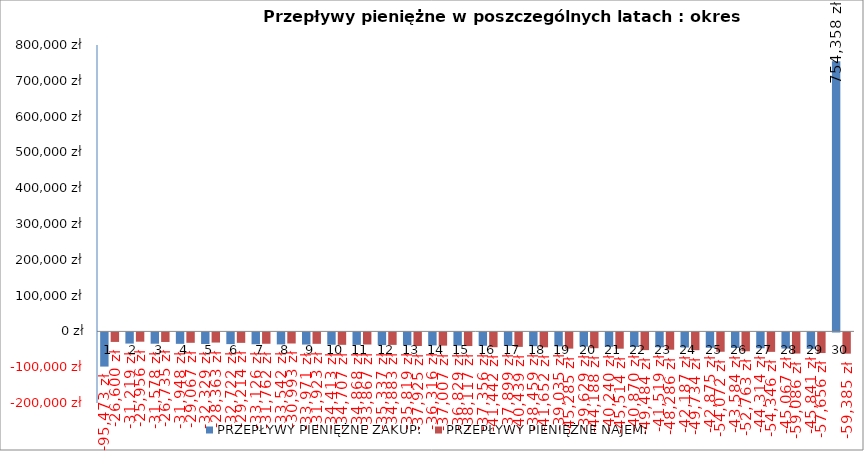
| Category | PRZEPŁYWY PIENIĘŻNE ZAKUP: | PRZEPŁYWY PIENIĘŻNE NAJEM: |
|---|---|---|
| 0 | -95472.749 | -26600 |
| 1 | -31218.969 | -25956 |
| 2 | -31578.15 | -26734.68 |
| 3 | -31948.107 | -29066.538 |
| 4 | -32329.163 | -28362.822 |
| 5 | -32721.651 | -29213.707 |
| 6 | -33125.913 | -31761.791 |
| 7 | -33542.303 | -30992.821 |
| 8 | -33971.184 | -31922.606 |
| 9 | -34412.932 | -34706.967 |
| 10 | -34867.933 | -33866.693 |
| 11 | -35336.583 | -34882.694 |
| 12 | -35819.293 | -37925.24 |
| 13 | -36316.485 | -37007.05 |
| 14 | -36828.592 | -38117.261 |
| 15 | -37356.062 | -41441.933 |
| 16 | -37899.356 | -40438.602 |
| 17 | -38458.95 | -41651.76 |
| 18 | -39035.331 | -45284.719 |
| 19 | -39629.003 | -44188.353 |
| 20 | -40240.486 | -45514.003 |
| 21 | -40870.313 | -49483.836 |
| 22 | -41519.035 | -48285.806 |
| 23 | -42187.218 | -49734.38 |
| 24 | -42875.447 | -54072.323 |
| 25 | -43584.323 | -52763.204 |
| 26 | -44314.466 | -54346.1 |
| 27 | -45066.512 | -59086.288 |
| 28 | -45841.12 | -57655.777 |
| 29 | 754357.649 | -59385.451 |